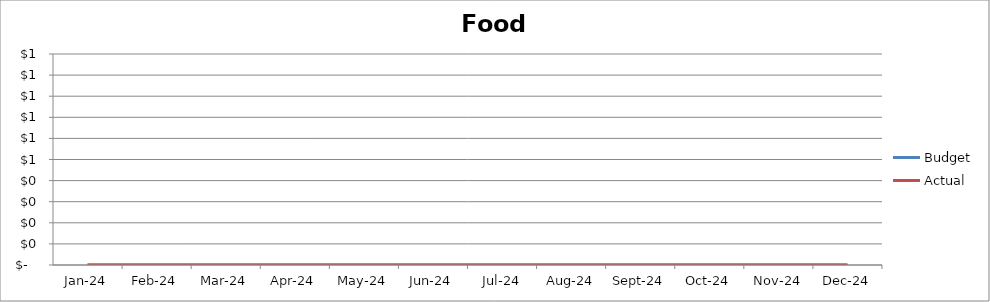
| Category | Budget | Actual |
|---|---|---|
| 2024-01-01 | 0 | 0 |
| 2024-02-01 | 0 | 0 |
| 2024-03-01 | 0 | 0 |
| 2024-04-01 | 0 | 0 |
| 2024-05-01 | 0 | 0 |
| 2024-06-01 | 0 | 0 |
| 2024-07-01 | 0 | 0 |
| 2024-08-01 | 0 | 0 |
| 2024-09-01 | 0 | 0 |
| 2024-10-01 | 0 | 0 |
| 2024-11-01 | 0 | 0 |
| 2024-12-01 | 0 | 0 |